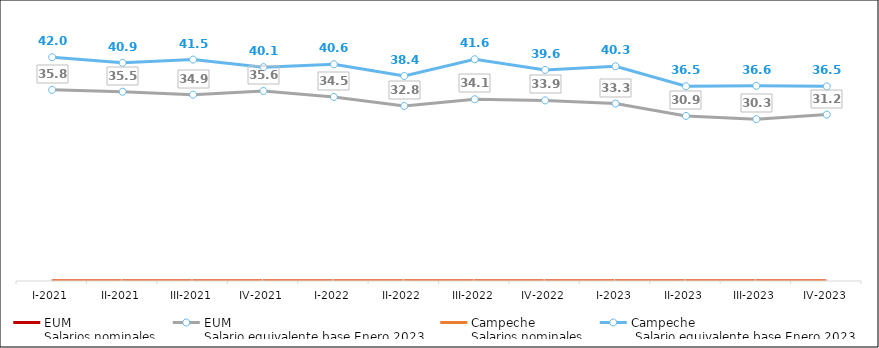
| Category | EUM 
Salarios nominales | EUM 
Salario equivalente base Enero 2023 | Campeche 
Salarios nominales | Campeche
 Salario equivalente base Enero 2023 |
|---|---|---|---|---|
| I-2021 | 0 | 35.837 | 0 | 41.96 |
| II-2021 | 0 | 35.487 | 0 | 40.9 |
| III-2021 | 0 | 34.936 | 0 | 41.519 |
| IV-2021 | 0 | 35.628 | 0 | 40.1 |
| I-2022 | 0 | 34.504 | 0 | 40.642 |
| II-2022 | 0 | 32.821 | 0 | 38.438 |
| III-2022 | 0 | 34.078 | 0 | 41.585 |
| IV-2022 | 0 | 33.859 | 0 | 39.577 |
| I-2023 | 0 | 33.263 | 0 | 40.258 |
| II-2023 | 0 | 30.948 | 0 | 36.511 |
| III-2023 | 0 | 30.343 | 0 | 36.6 |
| IV-2023 | 0 | 31.2 | 0 | 36.5 |